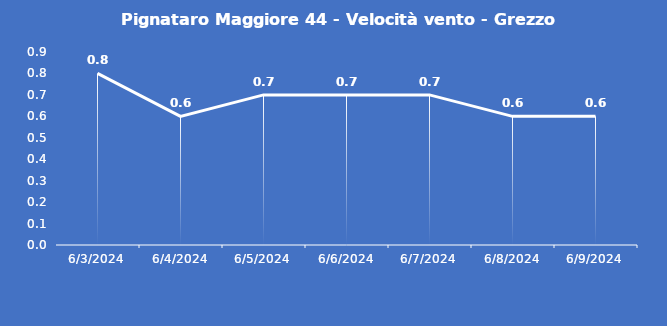
| Category | Pignataro Maggiore 44 - Velocità vento - Grezzo (m/s) |
|---|---|
| 6/3/24 | 0.8 |
| 6/4/24 | 0.6 |
| 6/5/24 | 0.7 |
| 6/6/24 | 0.7 |
| 6/7/24 | 0.7 |
| 6/8/24 | 0.6 |
| 6/9/24 | 0.6 |